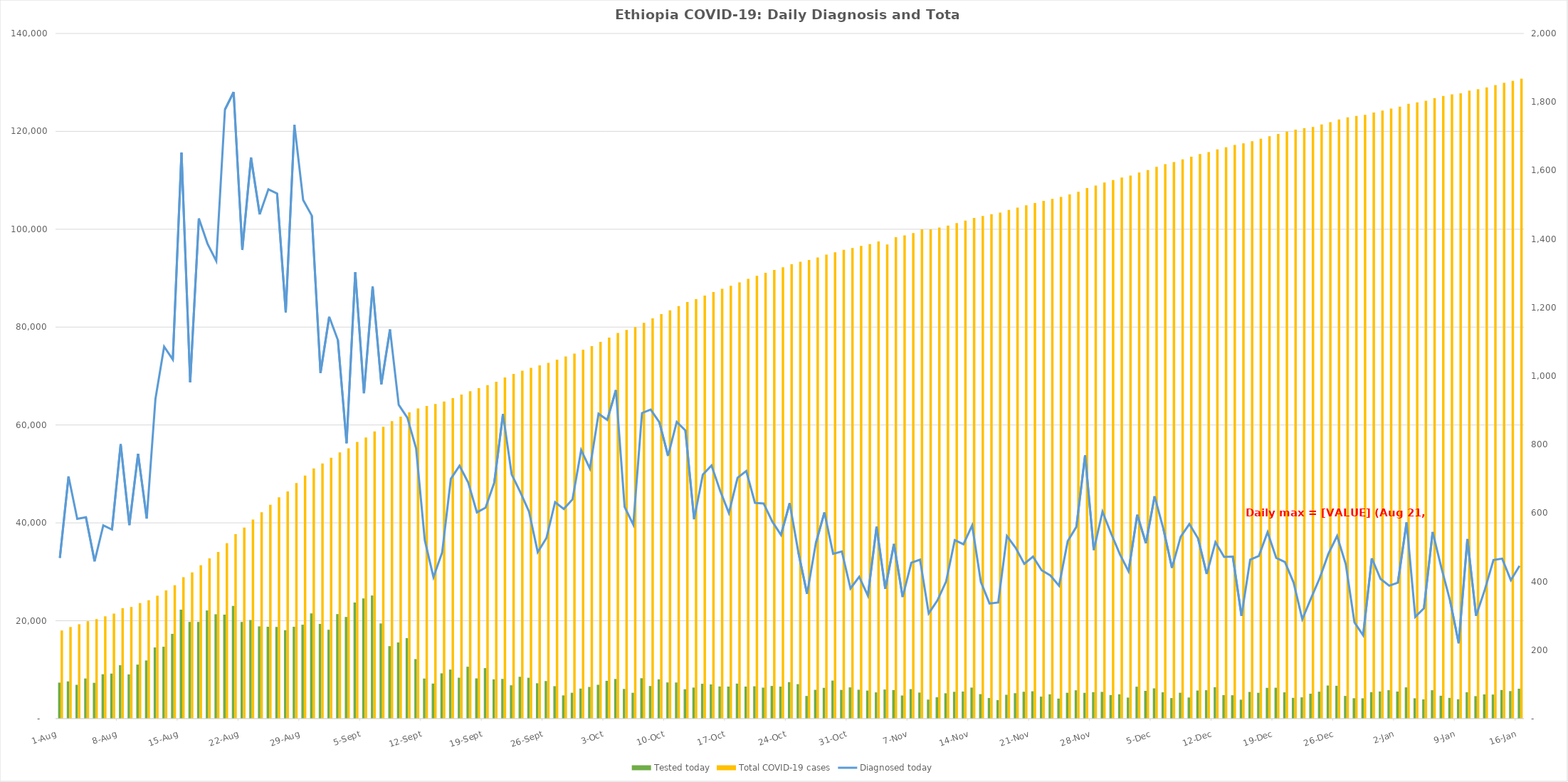
| Category | Tested today | Total COVID-19 cases |
|---|---|---|
| 2021-01-16 | 6111 | 130772 |
| 2021-01-15 | 5625 | 130326 |
| 2021-01-14 | 5848 | 129922 |
| 2021-01-13 | 4919 | 129455 |
| 2021-01-12 | 4949 | 128992 |
| 2021-01-11 | 4599 | 128616 |
| 2021-01-10 | 5381 | 128316 |
| 2021-01-09 | 3952 | 127792 |
| 2021-01-08 | 4240 | 127572 |
| 2021-01-07 | 4670 | 127227 |
| 2021-01-06 | 5801 | 126786 |
| 2021-01-05 | 3934 | 126241 |
| 2021-01-04 | 4157 | 125919 |
| 2021-01-03 | 6387 | 125622 |
| 2021-01-02 | 5532 | 125049 |
| 2021-01-01 | 5810 | 124652 |
| 2020-12-31 | 5547 | 124264 |
| 2020-12-30 | 5402 | 123856 |
| 2020-12-29 | 4155 | 123388 |
| 2020-12-28 | 4171 | 123145 |
| 2020-12-27 | 4639 | 122864 |
| 2020-12-26 | 6709 | 122413 |
| 2020-12-25 | 6762 | 121880 |
| 2020-12-24 | 5503 | 121399 |
| 2020-12-23 | 5096 | 120898 |
| 2020-12-22 | 4347 | 120638 |
| 2020-12-21 | 4242 | 120348 |
| 2020-12-20 | 5373 | 119951 |
| 2020-12-19 | 6313 | 119494 |
| 2020-12-18 | 6284 | 119025 |
| 2020-12-17 | 5276 | 118481 |
| 2020-12-16 | 5451 | 118006 |
| 2020-12-15 | 3867 | 117542 |
| 2020-12-14 | 4778 | 117242 |
| 2020-12-13 | 4799 | 116769 |
| 2020-12-12 | 6416 | 116297 |
| 2020-12-11 | 5807 | 115782 |
| 2020-12-10 | 5741 | 115360 |
| 2020-12-09 | 4313 | 114834 |
| 2020-12-08 | 5288 | 114266 |
| 2020-12-07 | 4203 | 113735 |
| 2020-12-06 | 5379 | 113295 |
| 2020-12-05 | 6185 | 112740 |
| 2020-12-04 | 5673 | 112091 |
| 2020-12-03 | 6522 | 111579 |
| 2020-12-02 | 4298 | 110984 |
| 2020-12-01 | 4968 | 110554 |
| 2020-11-30 | 4817 | 110074 |
| 2020-11-29 | 5466 | 109534 |
| 2020-11-28 | 5406 | 108930 |
| 2020-11-27 | 5271 | 108438 |
| 2020-11-26 | 5789 | 107669 |
| 2020-11-25 | 5283 | 107109 |
| 2020-11-24 | 4091 | 106591 |
| 2020-11-23 | 4963 | 106203 |
| 2020-11-22 | 4495 | 105785 |
| 2020-11-21 | 5589 | 105352 |
| 2020-11-20 | 5488 | 104879 |
| 2020-11-19 | 5201 | 104427 |
| 2020-11-18 | 4871 | 103928 |
| 2020-11-17 | 3778 | 103395 |
| 2020-11-16 | 4213 | 103056 |
| 2020-11-15 | 5002 | 102720 |
| 2020-11-14 | 6343 | 102321 |
| 2020-11-13 | 5532 | 101757 |
| 2020-11-12 | 5478 | 101248 |
| 2020-11-11 | 5183 | 100727 |
| 2020-11-10 | 4360 | 100327 |
| 2020-11-09 | 3889 | 99982 |
| 2020-11-08 | 5324 | 99967 |
| 2020-11-07 | 6028 | 99201 |
| 2020-11-06 | 4725 | 98746 |
| 2020-11-05 | 5839 | 98391 |
| 2020-11-04 | 5945 | 96881 |
| 2020-11-03 | 5364 | 97502 |
| 2020-11-02 | 5726 | 96942 |
| 2020-11-01 | 5901 | 96583 |
| 2020-10-31 | 6386 | 96169 |
| 2020-10-30 | 5866 | 95789 |
| 2020-10-29 | 7773 | 95301 |
| 2020-10-28 | 6290 | 94820 |
| 2020-10-27 | 5884 | 94218 |
| 2020-10-26 | 4628 | 93707 |
| 2020-10-25 | 7045 | 93343 |
| 2020-10-24 | 7454 | 92858 |
| 2020-10-23 | 6538 | 92229 |
| 2020-10-22 | 6676 | 91693 |
| 2020-10-21 | 6333 | 91118 |
| 2020-10-20 | 6602 | 90490 |
| 2020-10-19 | 6546 | 89860 |
| 2020-10-18 | 7151 | 89137 |
| 2020-10-17 | 6548 | 88434 |
| 2020-10-16 | 6569 | 87834 |
| 2020-10-15 | 6985 | 87169 |
| 2020-10-14 | 7121 | 86430 |
| 2020-10-13 | 6344 | 85718 |
| 2020-10-12 | 5997 | 85136 |
| 2020-10-11 | 7383 | 84295 |
| 2020-10-10 | 7394 | 83429 |
| 2020-10-09 | 8024 | 82662 |
| 2020-10-08 | 6668 | 81797 |
| 2020-10-07 | 8254 | 80895 |
| 2020-10-06 | 5278 | 80003 |
| 2020-10-05 | 6062 | 79437 |
| 2020-10-04 | 8101 | 78819 |
| 2020-10-03 | 7726 | 77860 |
| 2020-10-02 | 6916 | 76988 |
| 2020-10-01 | 6475 | 76098 |
| 2020-09-30 | 6139 | 75368 |
| 2020-09-29 | 5284 | 74584 |
| 2020-09-28 | 4747 | 73994 |
| 2020-09-27 | 6631 | 73332 |
| 2020-09-26 | 7679 | 72700 |
| 2020-09-25 | 7227 | 72173 |
| 2020-09-24 | 8348 | 71687 |
| 2020-09-23 | 8551 | 71083 |
| 2020-09-22 | 6813 | 70422 |
| 2020-09-21 | 8115 | 69709 |
| 2020-09-20 | 8023 | 68820 |
| 2020-09-19 | 10322 | 68131 |
| 2020-09-18 | 8221 | 67515 |
| 2020-09-17 | 10605 | 66913 |
| 2020-09-16 | 8355 | 66224 |
| 2020-09-15 | 10024 | 65486 |
| 2020-09-14 | 9256 | 64786 |
| 2020-09-13 | 7162 | 64301 |
| 2020-09-12 | 8191 | 63888 |
| 2020-09-11 | 12164 | 63367 |
| 2020-09-10 | 16445 | 62578 |
| 2020-09-09 | 15561 | 61700 |
| 2020-09-08 | 14815 | 60784 |
| 2020-09-07 | 19449 | 59648 |
| 2020-09-06 | 25158 | 58672 |
| 2020-09-05 | 24544 | 57466 |
| 2020-09-04 | 23712 | 56526 |
| 2020-09-03 | 20778 | 55223 |
| 2020-09-02 | 21360 | 54409 |
| 2020-09-01 | 18160 | 53304 |
| 2020-08-31 | 19364 | 52131 |
| 2020-08-30 | 21499 | 51122 |
| 2020-08-29 | 19194 | 49654 |
| 2020-08-28 | 18766 | 48140 |
| 2020-08-27 | 18060 | 46407 |
| 2020-08-26 | 18724 | 45211 |
| 2020-08-25 | 18778 | 43698 |
| 2020-08-24 | 18851 | 42153 |
| 2020-08-23 | 20153 | 40681 |
| 2020-08-22 | 19766 | 39044 |
| 2020-08-21 | 23035 | 37675 |
| 2020-08-20 | 21256 | 35846 |
| 2020-08-19 | 21326 | 34058 |
| 2020-08-18 | 22101 | 32732 |
| 2020-08-17 | 19747 | 31346 |
| 2020-08-16 | 19767 | 29876 |
| 2020-08-15 | 22252 | 28904 |
| 2020-08-14 | 17323 | 27252 |
| 2020-08-13 | 14688 | 26204 |
| 2020-08-12 | 14540 | 25118 |
| 2020-08-11 | 11881 | 24185 |
| 2020-08-10 | 11039 | 23601 |
| 2020-08-09 | 9035 | 22828 |
| 2020-08-08 | 10919 | 22563 |
| 2020-08-07 | 9203 | 21462 |
| 2020-08-06 | 9068 | 20910 |
| 2020-08-05 | 7319 | 20346 |
| 2020-08-04 | 8201 | 19887 |
| 2020-08-03 | 6907 | 19299 |
| 2020-08-02 | 7607 | 18716 |
| 2020-08-01 | 7358 | 18009 |